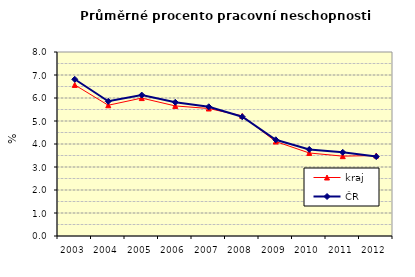
| Category | kraj | ČR |
|---|---|---|
| 2003.0 | 6.569 | 6.814 |
| 2004.0 | 5.685 | 5.857 |
| 2005.0 | 5.996 | 6.126 |
| 2006.0 | 5.655 | 5.814 |
| 2007.0 | 5.544 | 5.619 |
| 2008.0 | 5.221 | 5.184 |
| 2009.0 | 4.107 | 4.184 |
| 2010.0 | 3.61 | 3.763 |
| 2011.0 | 3.472 | 3.638 |
| 2012.0 | 3.499 | 3.452 |